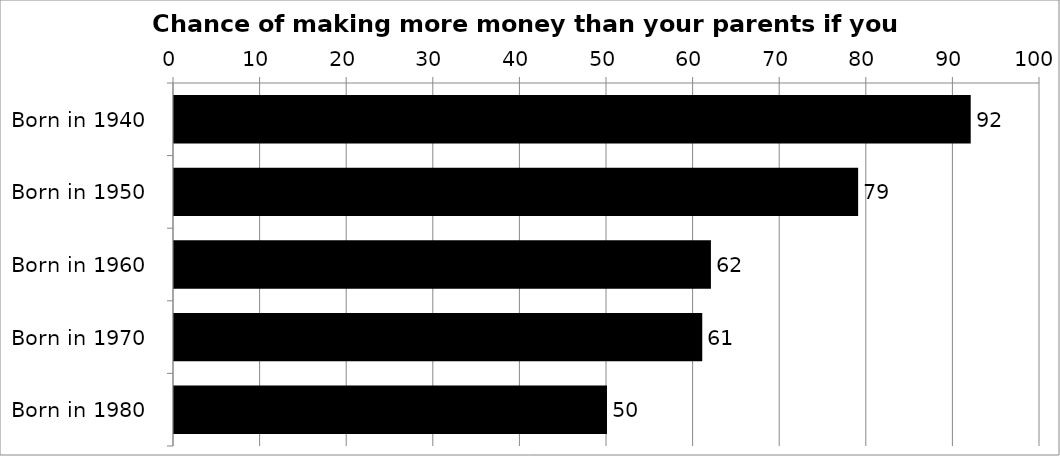
| Category | Series 0 |
|---|---|
| Born in 1940 | 92 |
| Born in 1950 | 79 |
| Born in 1960 | 62 |
| Born in 1970 | 61 |
| Born in 1980 | 50 |